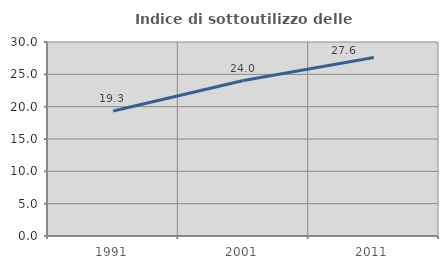
| Category | Indice di sottoutilizzo delle abitazioni  |
|---|---|
| 1991.0 | 19.32 |
| 2001.0 | 24.046 |
| 2011.0 | 27.613 |